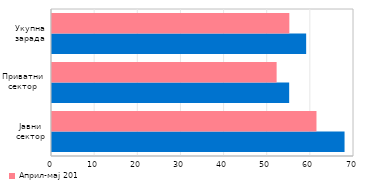
| Category | Април-мај 2020. | Април-мај 2019. |
|---|---|---|
| Јавни сектор | 67.81 | 61.304 |
| Приватни сектор | 54.974 | 52.067 |
| Укупна зарада | 58.912 | 55.012 |